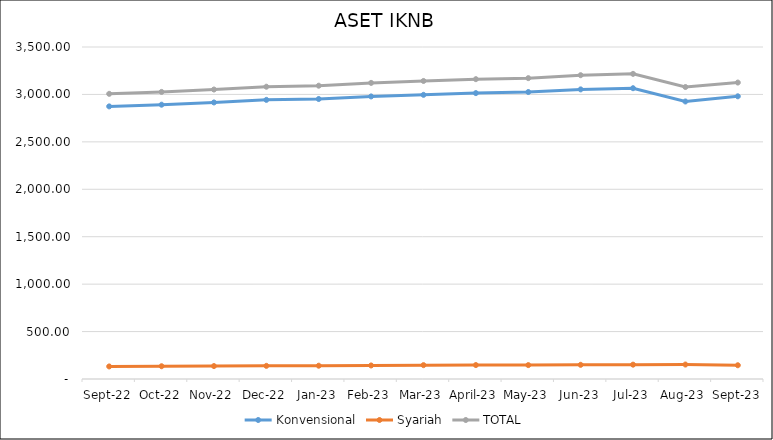
| Category |  Konvensional  |  Syariah  | TOTAL |
|---|---|---|---|
| Sep-22 | 2873.938 | 132.351 | 3006.289 |
| Oct-22 | 2891.826 | 134.628 | 3026.454 |
| Nov-22 | 2915.393 | 136.376 | 3051.769 |
| Dec-22 | 2942.716 | 138.533 | 3081.249 |
| Jan-23 | 2951.832 | 140.165 | 3091.997 |
| Feb-23 | 2978.913 | 142.696 | 3121.609 |
| Mar-23 | 2995.706 | 146.066 | 3141.772 |
| April-23 | 3013.962 | 147.013 | 3160.975 |
| May-23 | 3025.142 | 146.46 | 3171.602 |
| Jun-23 | 3053.172 | 149.576 | 3202.747 |
| Jul-23 | 3065.53 | 151.21 | 3216.74 |
| Aug-23 | 2925.63 | 152.49 | 3078.12 |
| Sep-23 | 2980.284 | 144.946 | 3125.23 |